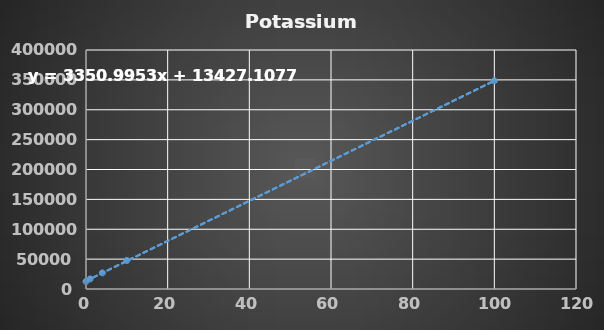
| Category | Potassium |
|---|---|
| 0.0 | 12553 |
| 1.0 | 16825 |
| 4.0 | 26933 |
| 10.0 | 47748 |
| 100.0 | 348441 |